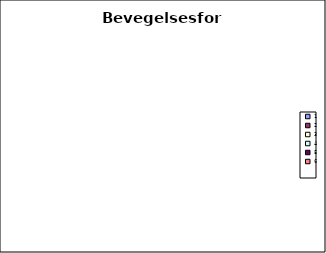
| Category | Bevegelsesform |
|---|---|
| 0 | 0 |
| 1 | 0 |
| 2 | 0 |
| 3 | 0 |
| 4 | 0 |
| 5 | 0 |